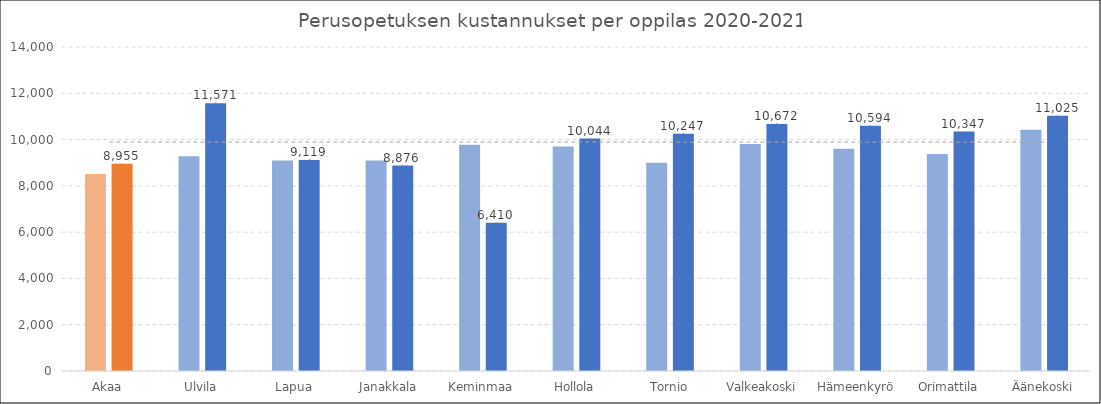
| Category | 2020 | 2021 |
|---|---|---|
| Akaa | 8515.12 | 8954.657 |
| Ulvila | 9280.775 | 11570.917 |
| Lapua | 9096.527 | 9118.706 |
| Janakkala | 9096.527 | 8875.597 |
| Keminmaa | 9775.691 | 6409.894 |
| Hollola | 9702.046 | 10043.962 |
| Tornio | 9002.136 | 10247.187 |
| Valkeakoski | 9808.867 | 10672.49 |
| Hämeenkyrö | 9603.501 | 10593.516 |
| Orimattila | 9373.913 | 10347.351 |
| Äänekoski | 10421.186 | 11024.832 |